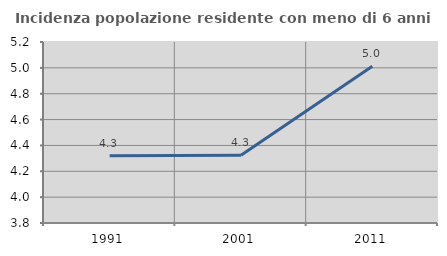
| Category | Incidenza popolazione residente con meno di 6 anni |
|---|---|
| 1991.0 | 4.32 |
| 2001.0 | 4.324 |
| 2011.0 | 5.013 |